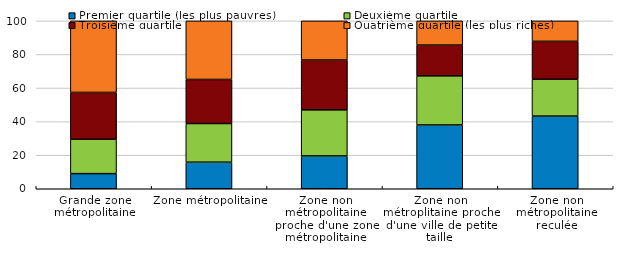
| Category | Premier quartile (les plus pauvres) | Deuxième quartile | Troisième quartile | Quatrième quartile (les plus riches) |
|---|---|---|---|---|
| Grande zone métropolitaine | 9.016 | 20.492 | 27.869 | 42.623 |
| Zone métropolitaine | 15.827 | 23.022 | 26.259 | 34.892 |
| Zone non métropolitaine proche d'une zone métropolitaine | 19.549 | 27.444 | 29.699 | 23.308 |
| Zone non métroplitaine proche d'une ville de petite taille | 37.991 | 29.258 | 18.341 | 14.41 |
| Zone non métropolitaine reculée | 43.293 | 21.951 | 22.561 | 12.195 |